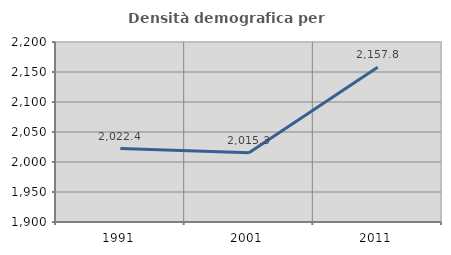
| Category | Densità demografica |
|---|---|
| 1991.0 | 2022.356 |
| 2001.0 | 2015.279 |
| 2011.0 | 2157.78 |